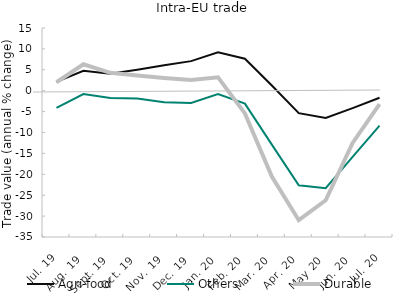
| Category | Agri-food | Others | Durable |
|---|---|---|---|
| Jul. 19 | 2.111 | -4.112 | 2.026 |
| Aug. 19 | 4.771 | -0.811 | 6.323 |
| Sept. 19 | 4.054 | -1.742 | 4.285 |
| Oct. 19 | 5.03 | -1.874 | 3.654 |
| Nov. 19 | 6.096 | -2.758 | 3.039 |
| Dec. 19 | 7.072 | -2.952 | 2.565 |
| Jan. 20 | 9.172 | -0.811 | 3.22 |
| Feb. 20 | 7.65 | -3.088 | -5.427 |
| Mar. 20 | 1.248 | -12.901 | -20.542 |
| Apr. 20 | -5.376 | -22.626 | -30.976 |
| May 20 | -6.525 | -23.337 | -26.219 |
| Jun. 20 | -4.159 | -15.819 | -12.505 |
| Jul. 20 | -1.683 | -8.333 | -3.196 |